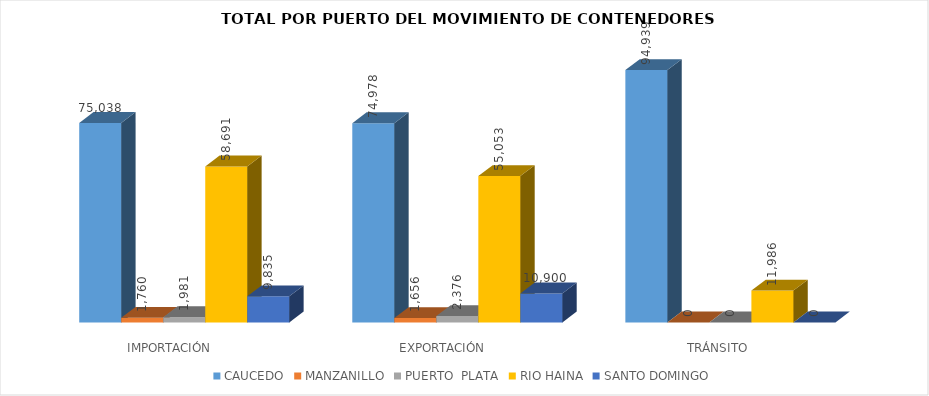
| Category | CAUCEDO | MANZANILLO | PUERTO  PLATA | RIO HAINA | SANTO DOMINGO |
|---|---|---|---|---|---|
| IMPORTACIÓN  | 75038 | 1760 | 1981 | 58691 | 9835 |
| EXPORTACIÓN  | 74978 | 1656 | 2376 | 55053 | 10900 |
| TRÁNSITO | 94939 | 0 | 0 | 11986 | 0 |